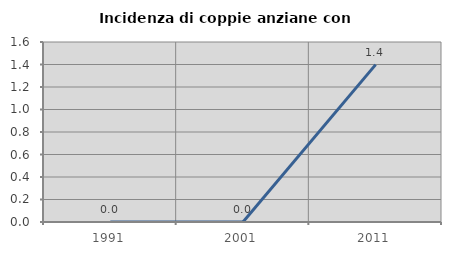
| Category | Incidenza di coppie anziane con figli |
|---|---|
| 1991.0 | 0 |
| 2001.0 | 0 |
| 2011.0 | 1.399 |